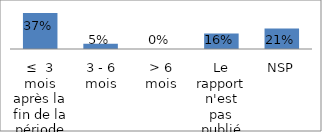
| Category | Series 0 |
|---|---|
| ≤  3 mois après la fin de la période | 0.368 |
| 3 - 6 mois | 0.053 |
| > 6 mois | 0 |
| Le rapport n'est pas publié | 0.158 |
| NSP | 0.211 |